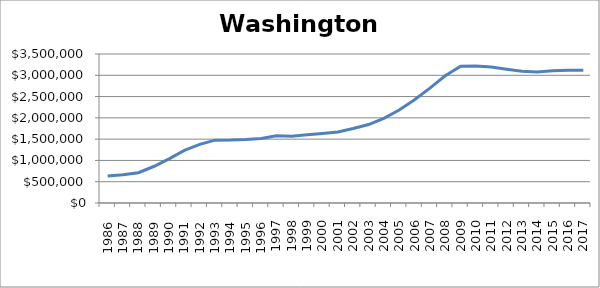
| Category | Washington (000s) |
|---|---|
|       1986 | 636700 |
|       1987 | 663350 |
|       1988 | 711350 |
|       1989 | 857100 |
|       1990 | 1037350 |
|       1991 | 1236900 |
|       1992 | 1376000 |
|       1993 | 1476900 |
|       1994 | 1479500 |
|       1995 | 1491650 |
|       1996 | 1517050 |
| 1997 | 1579500 |
| 1998 | 1565950 |
| 1999 | 1605800 |
| 2000 | 1634700 |
| 2001 | 1670150 |
| 2002 | 1749550 |
| 2003 | 1842700 |
| 2004 | 1989400 |
| 2005 | 2183020 |
| 2006 | 2425000 |
| 2007 | 2697600 |
| 2008 | 2989750 |
| 2009 | 3215150 |
| 2010 | 3217500 |
| 2011 | 3193150 |
| 2012 | 3143100 |
| 2013 | 3092500 |
| 2014 | 3074750 |
| 2015 | 3106200 |
| 2016 | 3120300 |
| 2017 | 3115950 |